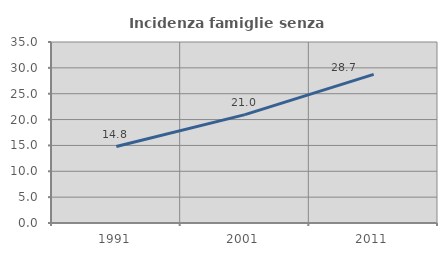
| Category | Incidenza famiglie senza nuclei |
|---|---|
| 1991.0 | 14.782 |
| 2001.0 | 20.963 |
| 2011.0 | 28.738 |